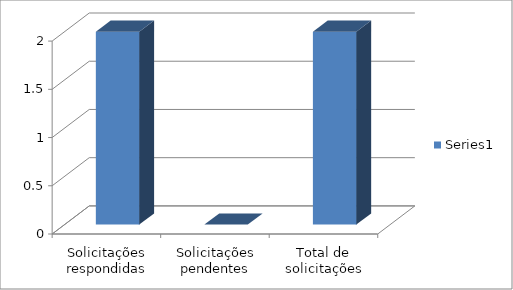
| Category | Series 0 |
|---|---|
| Solicitações respondidas | 2 |
| Solicitações pendentes | 0 |
| Total de solicitações | 2 |